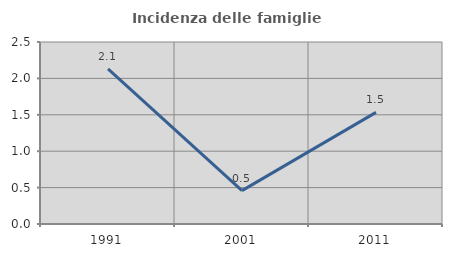
| Category | Incidenza delle famiglie numerose |
|---|---|
| 1991.0 | 2.132 |
| 2001.0 | 0.458 |
| 2011.0 | 1.534 |